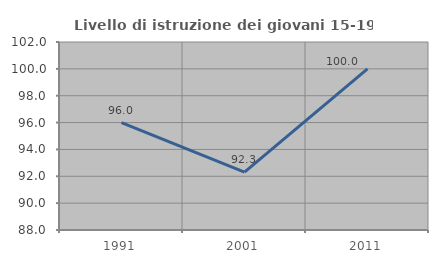
| Category | Livello di istruzione dei giovani 15-19 anni |
|---|---|
| 1991.0 | 96 |
| 2001.0 | 92.308 |
| 2011.0 | 100 |